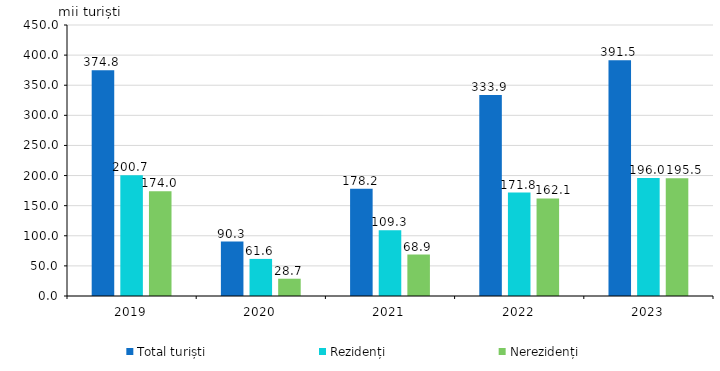
| Category | Total turiști | Rezidenți | Nerezidenți |
|---|---|---|---|
| 2019.0 | 374.8 | 200.7 | 174 |
| 2020.0 | 90.3 | 61.6 | 28.7 |
| 2021.0 | 178.2 | 109.3 | 68.9 |
| 2022.0 | 333.9 | 171.8 | 162.1 |
| 2023.0 | 391.5 | 196.024 | 195.5 |